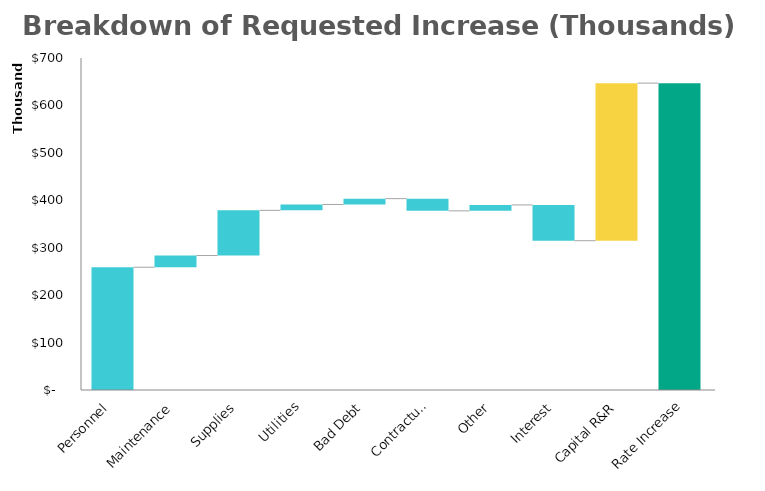
| Category | Average Bill | Average Bill w/Inflation |
|---|---|---|
| 2013.0 | 32.43 | 32.43 |
| 2014.0 | 32.43 | 33.298 |
| 2015.0 | 32.43 | 34.19 |
| 2016.0 | 32.43 | 35.105 |
| 2017.0 | 32.43 | 36.046 |
| 2018.0 | 32.43 | 37.011 |
| 2019.0 | 32.43 | 38.002 |
| 2020.0 | 32.43 | 39.019 |
| 2021.0 | 32.43 | 40.064 |
| 2022.0 | 32.43 | 41.137 |
| 2023.0 | 38.04 | 42.238 |